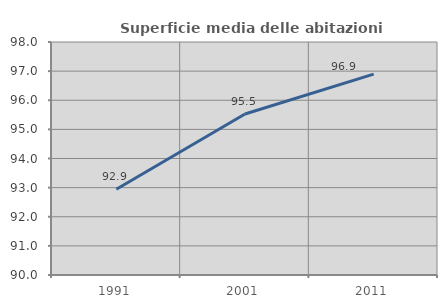
| Category | Superficie media delle abitazioni occupate |
|---|---|
| 1991.0 | 92.946 |
| 2001.0 | 95.526 |
| 2011.0 | 96.897 |